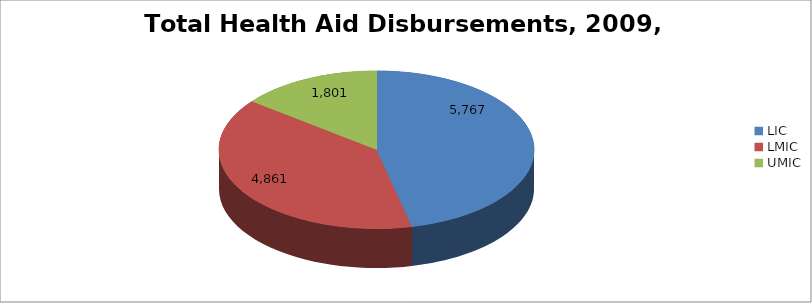
| Category | Series 0 |
|---|---|
| LIC | 5766.938 |
| LMIC | 4861.344 |
| UMIC | 1801.367 |